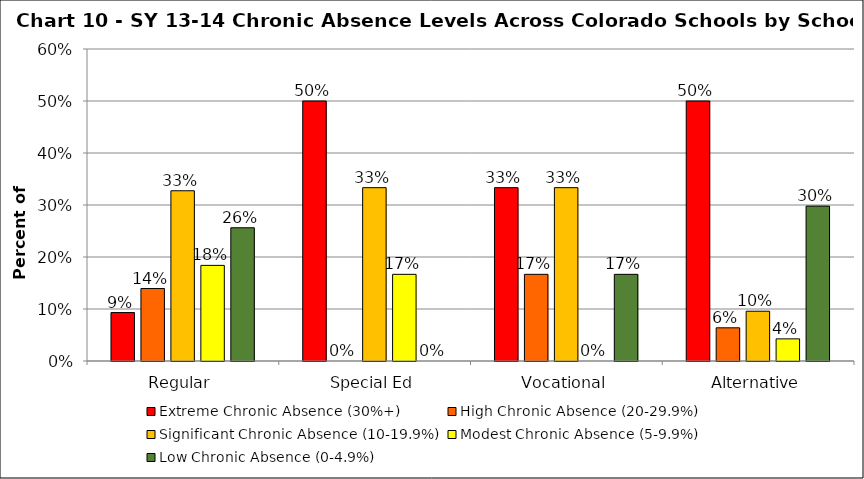
| Category | Extreme Chronic Absence (30%+) | High Chronic Absence (20-29.9%) | Significant Chronic Absence (10-19.9%) | Modest Chronic Absence (5-9.9%) | Low Chronic Absence (0-4.9%) |
|---|---|---|---|---|---|
| 0 | 0.093 | 0.139 | 0.327 | 0.184 | 0.256 |
| 1 | 0.5 | 0 | 0.333 | 0.167 | 0 |
| 2 | 0.333 | 0.167 | 0.333 | 0 | 0.167 |
| 3 | 0.5 | 0.064 | 0.096 | 0.043 | 0.298 |